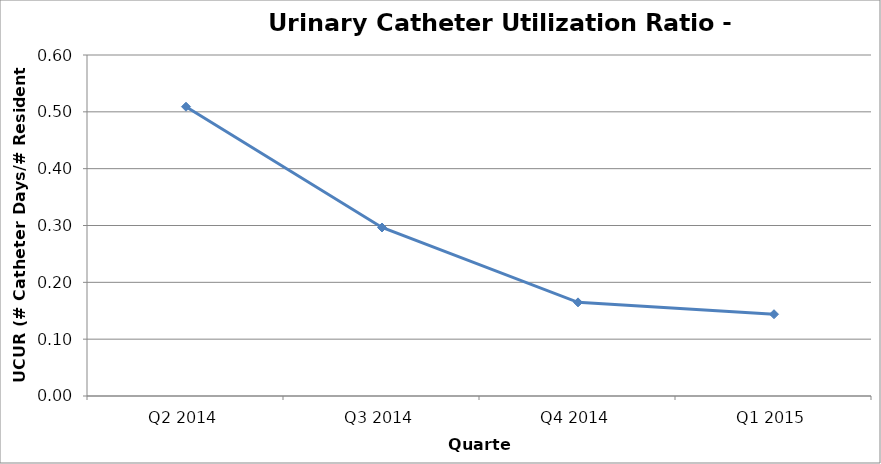
| Category | Series 0 |
|---|---|
| Q2 2014 | 0.509 |
| Q3 2014 | 0.296 |
| Q4 2014 | 0.165 |
| Q1 2015 | 0.144 |